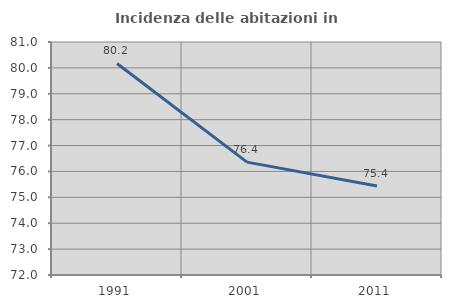
| Category | Incidenza delle abitazioni in proprietà  |
|---|---|
| 1991.0 | 80.172 |
| 2001.0 | 76.361 |
| 2011.0 | 75.437 |